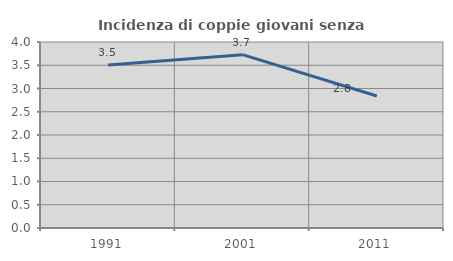
| Category | Incidenza di coppie giovani senza figli |
|---|---|
| 1991.0 | 3.507 |
| 2001.0 | 3.727 |
| 2011.0 | 2.839 |